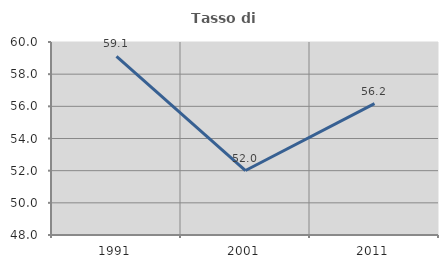
| Category | Tasso di occupazione   |
|---|---|
| 1991.0 | 59.101 |
| 2001.0 | 52.009 |
| 2011.0 | 56.171 |